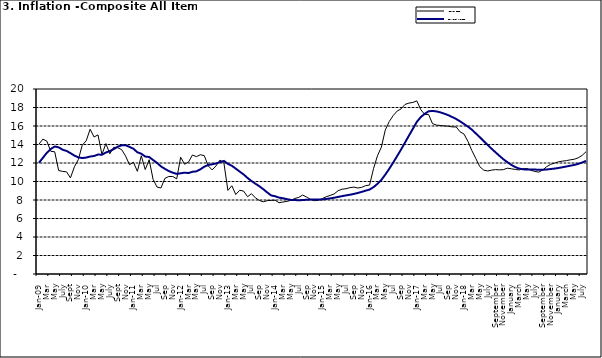
| Category | Year-on Rate | 12-Month Average |
|---|---|---|
| Jan-09 | 14.034 | 12.032 |
| Feb | 14.584 | 12.567 |
| Mar | 14.366 | 13.101 |
| Apr | 13.268 | 13.51 |
| May | 13.212 | 13.787 |
| June | 11.194 | 13.694 |
| July | 11.09 | 13.437 |
| Aug | 11.046 | 13.307 |
| Sept | 10.39 | 13.065 |
| Oct | 11.588 | 12.803 |
| Nov | 12.368 | 12.609 |
| Dec | 13.93 | 12.538 |
| Jan-10 | 14.398 | 12.586 |
| Feb | 15.649 | 12.7 |
| Mar | 14.812 | 12.757 |
| Apr | 15.044 | 12.915 |
| May | 12.915 | 12.893 |
| June | 14.099 | 13.132 |
| July | 13.002 | 13.284 |
| Aug | 13.702 | 13.5 |
| Sept | 13.65 | 13.764 |
| Oct | 13.45 | 13.908 |
| Nov | 12.766 | 13.928 |
| Dec | 11.815 | 13.74 |
| Jan-11 | 12.08 | 13.542 |
| Feb | 11.1 | 13.161 |
| Mar | 12.779 | 13.001 |
| Apr | 11.291 | 12.694 |
| May | 12.352 | 12.648 |
| Jun | 10.23 | 12.321 |
| Jul | 9.397 | 12.009 |
| Aug | 9.301 | 11.635 |
| Sep | 10.339 | 11.363 |
| Oct | 10.544 | 11.13 |
| Nov | 10.54 | 10.952 |
| Dec | 10.283 | 10.826 |
| Jan-12 | 12.626 | 10.886 |
| Feb | 11.866 | 10.955 |
| Mar | 12.111 | 10.914 |
| Apr | 12.866 | 11.054 |
| May | 12.688 | 11.096 |
| Jun | 12.892 | 11.32 |
| Jul | 12.797 | 11.599 |
| Aug | 11.689 | 11.791 |
| Sep | 11.253 | 11.859 |
| Oct | 11.693 | 11.948 |
| Nov | 12.32 | 12.091 |
| Dec | 11.981 | 12.224 |
| Jan-13 | 9.031 | 11.908 |
| Feb | 9.542 | 11.703 |
| Mar | 8.593 | 11.394 |
| Apr | 9.052 | 11.072 |
| May | 8.964 | 10.761 |
| Jun | 8.353 | 10.383 |
| Jul | 8.682 | 10.047 |
| Aug | 8.231 | 9.761 |
| Sep | 7.952 | 9.486 |
| Oct | 7.807 | 9.167 |
| Nov | 7.931 | 8.815 |
| Dec | 7.957 | 8.496 |
| Jan-14 | 7.977 | 8.408 |
| Feb | 7.707 | 8.257 |
| Mar | 7.783 | 8.19 |
| Apr | 7.851 | 8.092 |
| May | 7.965 | 8.012 |
| Jun | 8.167 | 7.998 |
| Jul | 8.281 | 7.968 |
| Aug | 8.534 | 7.996 |
| Sep | 8.317 | 8.027 |
| Oct | 8.06 | 8.047 |
| Nov | 7.927 | 8.046 |
| Dec | 7.978 | 8.047 |
| Jan-15 | 8.157 | 8.063 |
| Feb | 8.359 | 8.117 |
| Mar | 8.494 | 8.176 |
| Apr | 8.655 | 8.243 |
| May | 9.003 | 8.331 |
| Jun | 9.168 | 8.417 |
| Jul | 9.218 | 8.497 |
| Aug | 9.336 | 8.566 |
| Sep | 9.394 | 8.658 |
| Oct | 9.296 | 8.76 |
| Nov | 9.368 | 8.879 |
| Dec | 9.554 | 9.009 |
| Jan-16 | 9.617 | 9.13 |
| Feb | 11.379 | 9.386 |
| Mar | 12.775 | 9.751 |
| Apr | 13.721 | 10.182 |
| May | 15.577 | 10.746 |
| Jun | 16.48 | 11.372 |
| Jul | 17.127 | 12.045 |
| Aug | 17.609 | 12.744 |
| Sep | 17.852 | 13.454 |
| Oct | 18.33 | 14.206 |
| Nov | 18.476 | 14.958 |
| Dec | 18.547 | 15.697 |
| Jan-17 | 18.719 | 16.441 |
| Feb | 17.78 | 16.958 |
| Mar | 17.256 | 17.315 |
| Apr | 17.244 | 17.591 |
| May | 16.251 | 17.628 |
| Jun | 16.098 | 17.578 |
| Jul | 16.053 | 17.475 |
| Aug | 16.012 | 17.331 |
| Sep | 15.979 | 17.17 |
| Oct | 15.905 | 16.968 |
| Nov | 15.901 | 16.76 |
| Dec | 15.372 | 16.502 |
| Jan-18 | 15.127 | 16.215 |
| Feb | 14.33 | 15.93 |
| Mar | 13.337 | 15.599 |
| Apr | 12.482 | 15.196 |
| May | 11.608 | 14.793 |
| June | 11.231 | 14.371 |
| July | 11.142 | 13.95 |
| August | 11.227 | 13.546 |
| September | 11.284 | 13.157 |
| October | 11.259 | 12.777 |
| November | 11.281 | 12.406 |
| December | 11.442 | 12.095 |
| January | 11.374 | 11.801 |
| February | 11.306 | 11.564 |
| March | 11.251 | 11.401 |
| April | 11.372 | 11.314 |
| May | 11.396 | 11.299 |
| June | 11.217 | 11.297 |
| July | 11.084 | 11.291 |
| August | 11.016 | 11.271 |
| September | 11.244 | 11.268 |
| October | 11.607 | 11.298 |
| November | 11.854 | 11.348 |
| December | 11.982 | 11.396 |
| January | 12.132 | 11.462 |
| February | 12.199 | 11.539 |
| March | 12.257 | 11.624 |
| April | 12.341 | 11.706 |
| May | 12.404 | 11.791 |
| June | 12.559 | 11.904 |
| July | 12.821 | 12.049 |
| August | 13.22 | 12.233 |